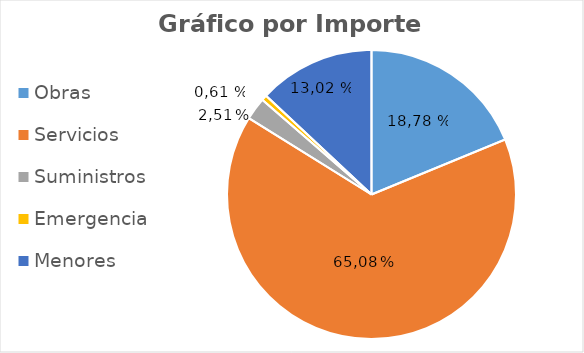
| Category | Series 0 |
|---|---|
| Obras | 10413463.61 |
| Servicios | 36082667.84 |
| Suministros | 1393057.74 |
| Emergencia | 336818 |
| Menores | 7221104.32 |